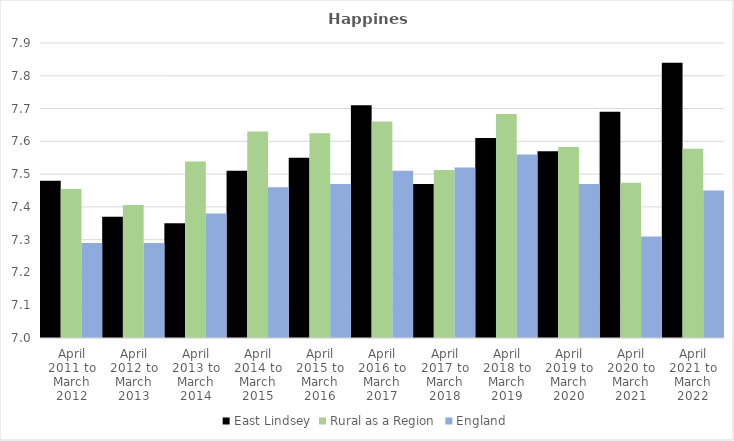
| Category | East Lindsey | Rural as a Region | England |
|---|---|---|---|
| April 2011 to March 2012 | 7.48 | 7.454 | 7.29 |
| April 2012 to March 2013 | 7.37 | 7.406 | 7.29 |
| April 2013 to March 2014 | 7.35 | 7.539 | 7.38 |
| April 2014 to March 2015 | 7.51 | 7.63 | 7.46 |
| April 2015 to March 2016 | 7.55 | 7.625 | 7.47 |
| April 2016 to March 2017 | 7.71 | 7.661 | 7.51 |
| April 2017 to March 2018 | 7.47 | 7.513 | 7.52 |
| April 2018 to March 2019 | 7.61 | 7.684 | 7.56 |
| April 2019 to March 2020 | 7.57 | 7.582 | 7.47 |
| April 2020 to March 2021 | 7.69 | 7.474 | 7.31 |
| April 2021 to March 2022 | 7.84 | 7.577 | 7.45 |